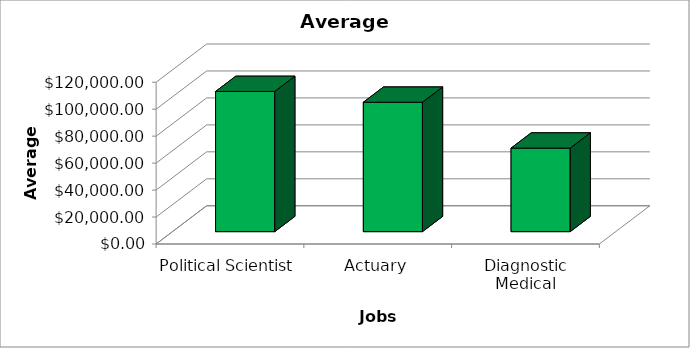
| Category | Series 0 |
|---|---|
| Political Scientist | 104000 |
| Actuary | 96000 |
| Diagnostic Medical Sonographer | 61980 |